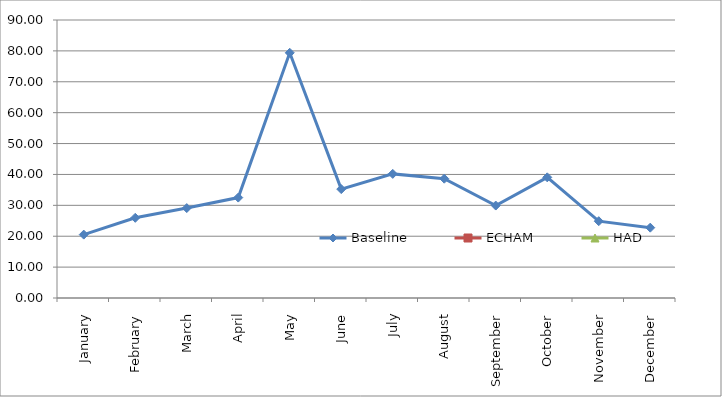
| Category | Baseline | ECHAM | HAD |
|---|---|---|---|
| January | 20.517 |  |  |
| February | 25.962 |  |  |
| March | 29.11 |  |  |
| April | 32.507 |  |  |
| May | 79.383 |  |  |
| June | 35.248 |  |  |
| July | 40.179 |  |  |
| August | 38.624 |  |  |
| September | 29.928 |  |  |
| October | 39.066 |  |  |
| November | 24.869 |  |  |
| December | 22.772 |  |  |